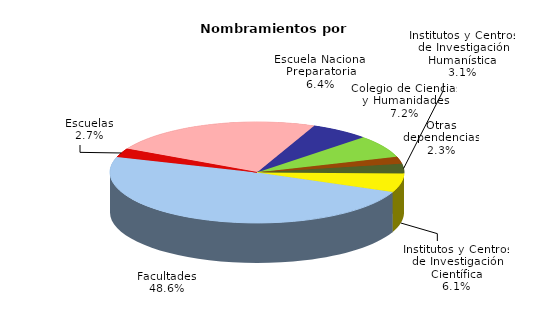
| Category | Series 0 |
|---|---|
| Institutos y Centros de Investigación Humanística | 1545 |
| Institutos y Centros de Investigación Científica | 3061 |
| Facultades | 24461 |
| Escuelas | 1383 |
| Unidades Multidisciplinarias | 11917 |
| Escuela Nacional Preparatoria | 3246 |
| Colegio de Ciencias y Humanidades | 3612 |
| Otras dependencias | 1144 |